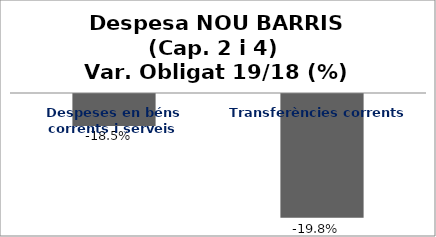
| Category | Series 0 |
|---|---|
| Despeses en béns corrents i serveis | -0.185 |
| Transferències corrents | -0.198 |